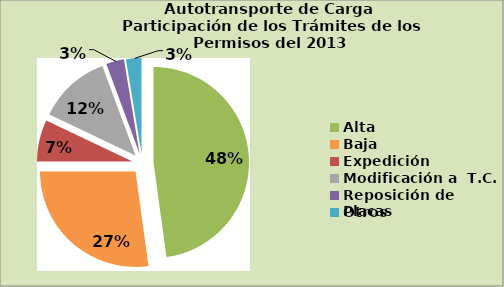
| Category | Series 0 |
|---|---|
| Alta                                         | 47.825 |
| Baja | 27.177 |
| Expedición | 7.074 |
| Modificación a  T.C. | 12.275 |
| Reposición de Placas | 3.034 |
| Otros | 2.614 |